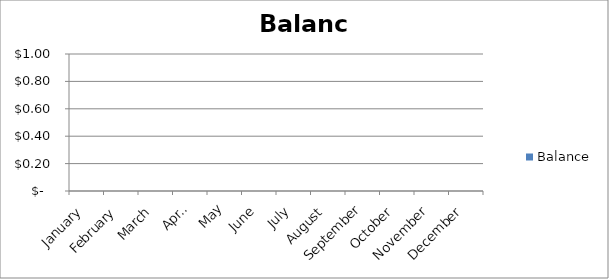
| Category | Balance |
|---|---|
| January | 0 |
| February | 0 |
| March | 0 |
| April | 0 |
| May | 0 |
| June | 0 |
| July | 0 |
| August | 0 |
| September | 0 |
| October | 0 |
| November | 0 |
| December | 0 |